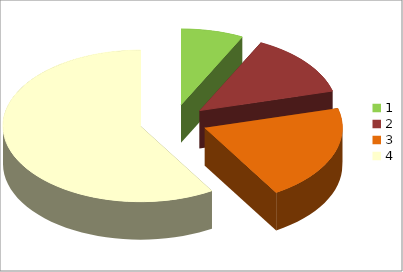
| Category | Series 0 |
|---|---|
| 0 | 19 |
| 1 | 35 |
| 2 | 53 |
| 3 | 152 |